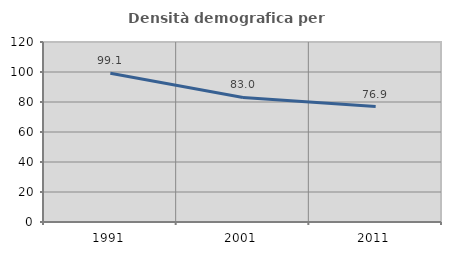
| Category | Densità demografica |
|---|---|
| 1991.0 | 99.134 |
| 2001.0 | 83.02 |
| 2011.0 | 76.94 |